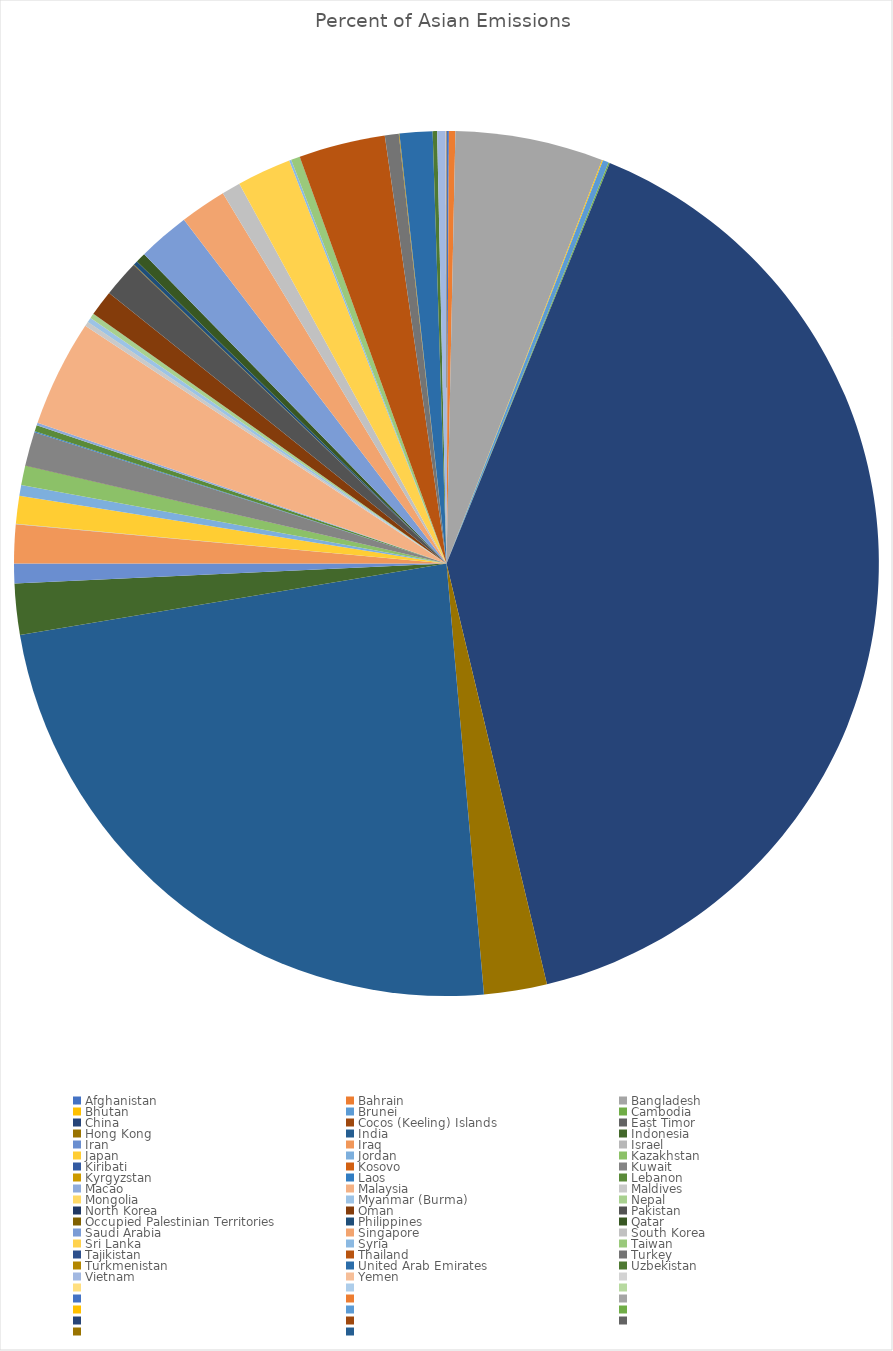
| Category | Percent of Asian Emissions  |
|---|---|
| Afghanistan | 0.001 |
| Bahrain | 0.002 |
| Bangladesh | 0.055 |
| Bhutan | 0 |
| Brunei | 0.002 |
| Cambodia | 0 |
| China | 0.401 |
| Cocos (Keeling) Islands | 0 |
| East Timor | 0 |
| Hong Kong | 0.024 |
| India | 0.237 |
| Indonesia | 0.019 |
| Iran | 0.007 |
| Iraq | 0.014 |
| Israel | 0 |
| Japan | 0.01 |
| Jordan | 0.004 |
| Kazakhstan | 0.007 |
| Kiribati | 0 |
| Kosovo | 0 |
| Kuwait | 0.013 |
| Kyrgyzstan | 0 |
| Laos | 0 |
| Lebanon | 0.002 |
| Macao | 0.001 |
| Malaysia | 0.04 |
| Maldives | 0.002 |
| Mongolia | 0 |
| Myanmar (Burma) | 0.002 |
| Nepal | 0.002 |
| North Korea | 0 |
| Oman | 0.01 |
| Pakistan | 0.014 |
| Occupied Palestinian Territories | 0 |
| Philippines | 0.002 |
| Qatar | 0.004 |
| Saudi Arabia | 0.019 |
| Singapore | 0.017 |
| South Korea | 0.007 |
| Sri Lanka | 0.02 |
| Syria | 0.001 |
| Taiwan | 0.003 |
| Tajikistan | 0 |
| Thailand | 0.032 |
| Turkey | 0.005 |
| Turkmenistan | 0 |
| United Arab Emirates | 0.012 |
| Uzbekistan | 0.002 |
| Vietnam | 0.003 |
| Yemen | 0 |